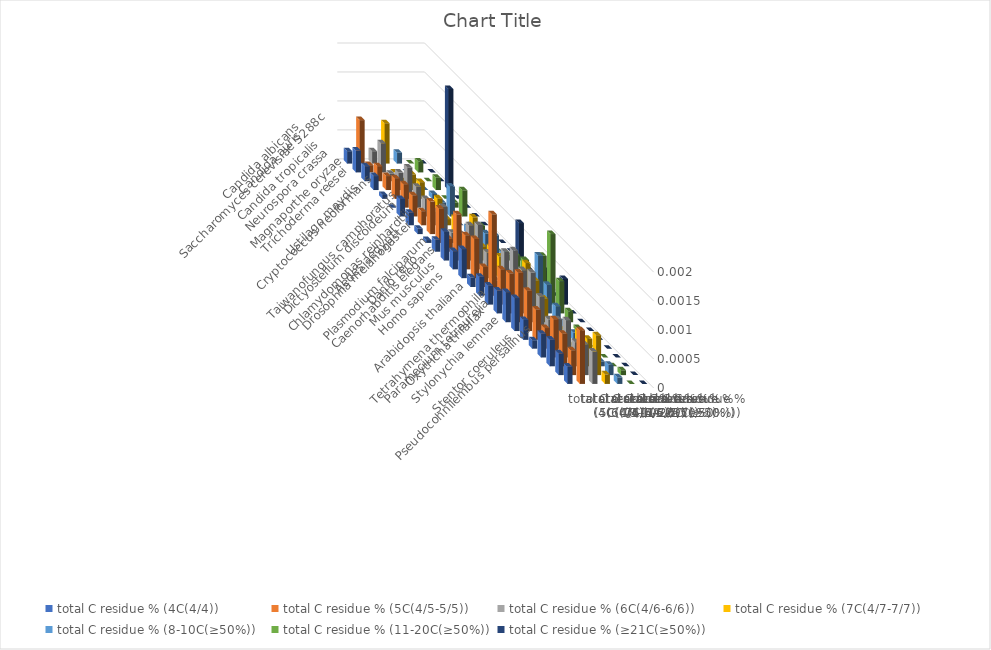
| Category | total C residue % (4C(4/4)) | total C residue % (5C(4/5-5/5)) | total C residue % (6C(4/6-6/6)) | total C residue % (7C(4/7-7/7)) | total C residue % (8-10C(≥50%)) | total C residue % (11-20C(≥50%)) | total C residue % (≥21C(≥50%)) |
|---|---|---|---|---|---|---|---|
| Saccharomyces cerevisiae S288c | 0 | 0.001 | 0 | 0.001 | 0 | 0 | 0 |
| Candida albicans | 0 | 0 | 0.001 | 0 | 0 | 0 | 0 |
| Candida auris | 0 | 0 | 0 | 0 | 0 | 0 | 0 |
| Candida tropicalis | 0 | 0 | 0 | 0 | 0 | 0 | 0.002 |
| Neurospora crassa | 0 | 0 | 0.001 | 0 | 0 | 0 | 0 |
| Magnaporthe oryzae | 0 | 0 | 0 | 0 | 0 | 0 | 0 |
| Trichoderma reesei | 0 | 0 | 0 | 0 | 0.001 | 0 | 0 |
| Cryptococcus neoformans | 0 | 0 | 0 | 0 | 0 | 0 | 0 |
| Ustilago maydis | 0 | 0.001 | 0 | 0 | 0 | 0 | 0 |
| Taiwanofungus camphoratus | 0 | 0.001 | 0 | 0 | 0 | 0 | 0 |
| Dictyostelium discoideum | 0 | 0 | 0 | 0.001 | 0 | 0 | 0 |
| Chlamydomonas reinhardtii | 0 | 0.001 | 0.001 | 0 | 0 | 0 | 0.001 |
| Drosophila melanogaster | 0 | 0.001 | 0.001 | 0 | 0 | 0 | 0 |
| Aedes aegypti | 0.001 | 0.001 | 0 | 0 | 0 | 0 | 0 |
| Plasmodium falciparum | 0 | 0 | 0 | 0 | 0 | 0 | 0 |
| Caenorhabditis elegans | 0 | 0.001 | 0.001 | 0 | 0 | 0.001 | 0 |
| Danio rerio | 0 | 0.001 | 0.001 | 0.001 | 0.001 | 0.001 | 0 |
| Mus musculus | 0 | 0.001 | 0.001 | 0.001 | 0 | 0.001 | 0 |
| Homo sapiens | 0.001 | 0.001 | 0.001 | 0 | 0 | 0 | 0 |
| Arabidopsis thaliana | 0.001 | 0.001 | 0.001 | 0 | 0 | 0 | 0 |
| Tetrahymena thermophila | 0 | 0.001 | 0 | 0 | 0 | 0 | 0 |
| Paramecium tetraurelia | 0 | 0 | 0.001 | 0 | 0 | 0 | 0 |
| Oxytricha trifallax | 0 | 0.001 | 0.001 | 0 | 0 | 0 | 0 |
| Stylonychia lemnae | 0 | 0.001 | 0 | 0 | 0 | 0 | 0 |
| Pseudocohnilembus persalinus | 0 | 0 | 0.001 | 0.001 | 0 | 0 | 0 |
| Stentor coeruleus | 0 | 0.001 | 0.001 | 0 | 0 | 0 | 0 |